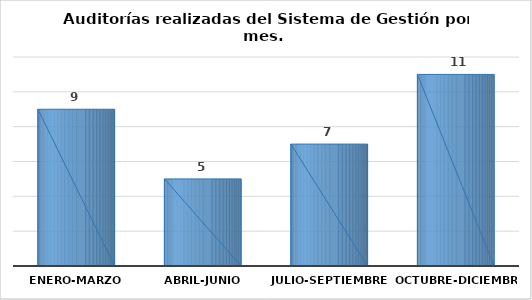
| Category | Series 0 |
|---|---|
| Enero-Marzo | 9 |
| Abril-Junio | 5 |
| Julio-Septiembre | 7 |
| Octubre-Diciembre | 11 |